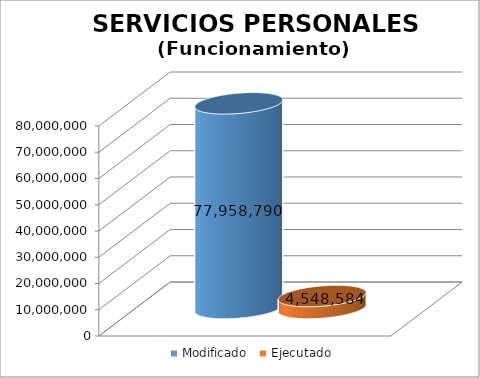
| Category | Modificado | Ejecutado |
|---|---|---|
| 0 | 77958790 | 4548584.23 |